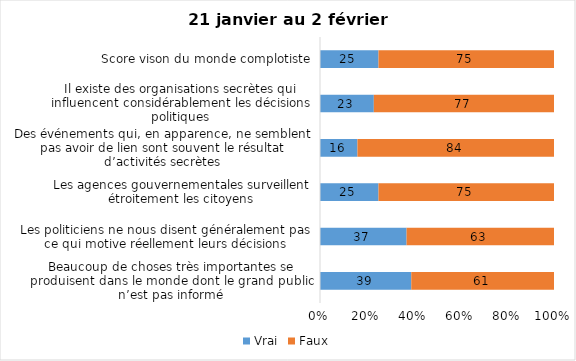
| Category | Vrai | Faux |
|---|---|---|
| Beaucoup de choses très importantes se produisent dans le monde dont le grand public n’est pas informé | 39 | 61 |
| Les politiciens ne nous disent généralement pas ce qui motive réellement leurs décisions | 37 | 63 |
| Les agences gouvernementales surveillent étroitement les citoyens | 25 | 75 |
| Des événements qui, en apparence, ne semblent pas avoir de lien sont souvent le résultat d’activités secrètes | 16 | 84 |
| Il existe des organisations secrètes qui influencent considérablement les décisions politiques | 23 | 77 |
| Score vison du monde complotiste | 25 | 75 |